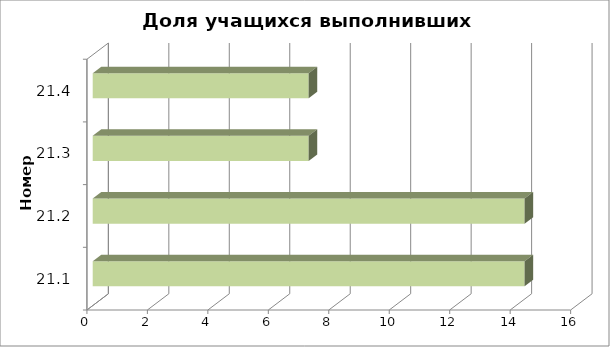
| Category | Доля учащихся выполнивших критерий |
|---|---|
| 21.1 | 14.286 |
| 21.2 | 14.286 |
| 21.3 | 7.143 |
| 21.4 | 7.143 |